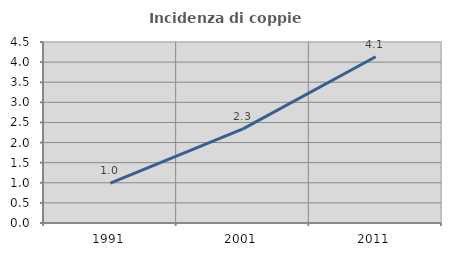
| Category | Incidenza di coppie miste |
|---|---|
| 1991.0 | 0.993 |
| 2001.0 | 2.342 |
| 2011.0 | 4.132 |